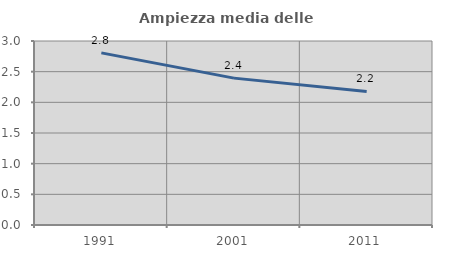
| Category | Ampiezza media delle famiglie |
|---|---|
| 1991.0 | 2.807 |
| 2001.0 | 2.395 |
| 2011.0 | 2.178 |